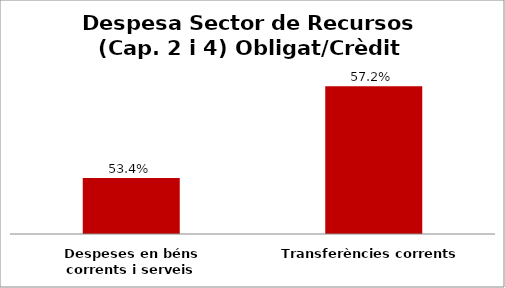
| Category | Series 0 |
|---|---|
| Despeses en béns corrents i serveis | 0.534 |
| Transferències corrents | 0.572 |